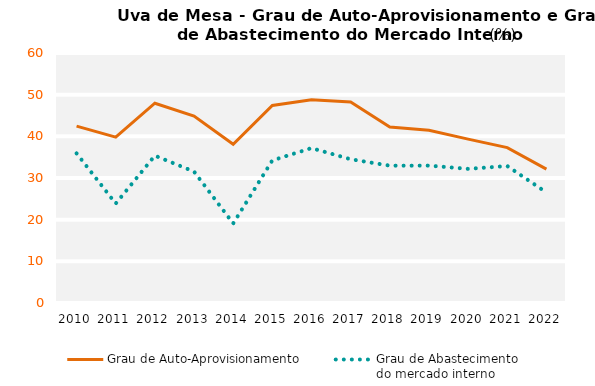
| Category | Grau de Auto-Aprovisionamento | Grau de Abastecimento
do mercado interno |
|---|---|---|
| 2010.0 | 42.437 | 35.91 |
| 2011.0 | 39.82 | 23.867 |
| 2012.0 | 47.947 | 35.364 |
| 2013.0 | 44.864 | 31.541 |
| 2014.0 | 38.101 | 19.089 |
| 2015.0 | 47.414 | 34.229 |
| 2016.0 | 48.765 | 37.172 |
| 2017.0 | 48.217 | 34.503 |
| 2018.0 | 42.236 | 32.957 |
| 2019.0 | 41.441 | 32.975 |
| 2020.0 | 39.327 | 32.193 |
| 2021.0 | 37.286 | 32.872 |
| 2022.0 | 32.14 | 26.529 |